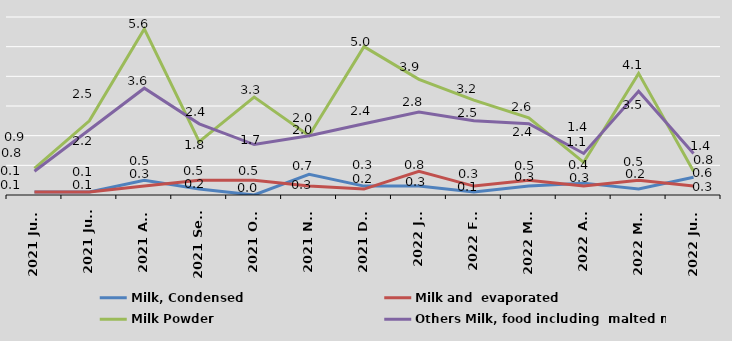
| Category | Milk, Condensed | Milk and  evaporated | Milk Powder | Others Milk, food including  malted milk |
|---|---|---|---|---|
| 2021 June | 0.1 | 0.1 | 0.9 | 0.8 |
| 2021 July | 0.1 | 0.1 | 2.5 | 2.2 |
| 2021 Aug | 0.5 | 0.3 | 5.6 | 3.6 |
| 2021 Sept | 0.2 | 0.5 | 1.8 | 2.4 |
| 2021 Oct | 0 | 0.5 | 3.3 | 1.7 |
| 2021 Nov | 0.7 | 0.3 | 2 | 2 |
| 2021 Dec | 0.3 | 0.2 | 5 | 2.4 |
| 2022 Jan | 0.3 | 0.8 | 3.9 | 2.8 |
| 2022 Feb | 0.1 | 0.3 | 3.2 | 2.5 |
| 2022 Mar | 0.3 | 0.5 | 2.6 | 2.4 |
| 2022 Apr | 0.4 | 0.3 | 1.1 | 1.4 |
| 2022 May | 0.2 | 0.5 | 4.1 | 3.5 |
| 2022 June | 0.6 | 0.3 | 0.8 | 1.4 |